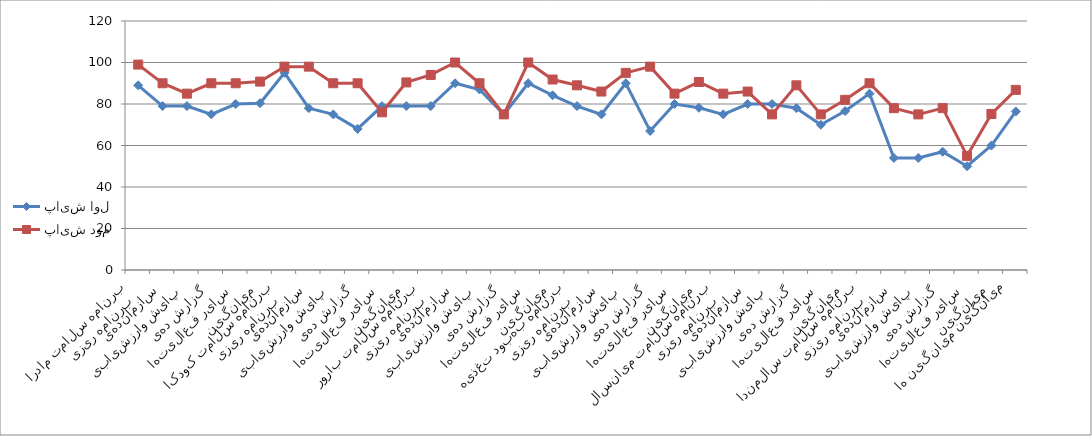
| Category | پایش اول | پایش دوم |
|---|---|---|
| 0 | 89 | 99 |
| 1 | 79 | 90 |
| 2 | 79 | 85 |
| 3 | 75 | 90 |
| 4 | 80 | 90 |
| 5 | 80.4 | 90.8 |
| 6 | 95 | 98 |
| 7 | 78 | 98 |
| 8 | 75 | 90 |
| 9 | 68 | 90 |
| 10 | 79 | 76 |
| 11 | 79 | 90.4 |
| 12 | 79 | 94 |
| 13 | 90 | 100 |
| 14 | 87 | 90 |
| 15 | 75 | 75 |
| 16 | 90 | 100 |
| 17 | 84.2 | 91.8 |
| 18 | 79 | 89 |
| 19 | 75 | 86 |
| 20 | 90 | 95 |
| 21 | 67 | 98 |
| 22 | 80 | 85 |
| 23 | 78.2 | 90.6 |
| 24 | 75 | 85 |
| 25 | 80 | 86 |
| 26 | 80 | 75 |
| 27 | 78 | 89 |
| 28 | 70 | 75 |
| 29 | 76.6 | 82 |
| 30 | 85 | 90 |
| 31 | 54 | 78 |
| 32 | 54 | 75 |
| 33 | 57 | 78 |
| 34 | 50 | 55 |
| 35 | 60 | 75.2 |
| 36 | 76.4 | 86.8 |